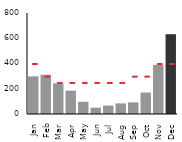
| Category | Donuts |
|---|---|
| Jan | 298 |
| Feb | 311 |
| Mar | 243 |
| Apr | 185 |
| May | 97 |
| Jun | 50 |
| Jul | 67 |
| Aug | 84 |
| Sep | 92 |
| Oct | 170 |
| Nov | 389 |
| Dec | 632 |